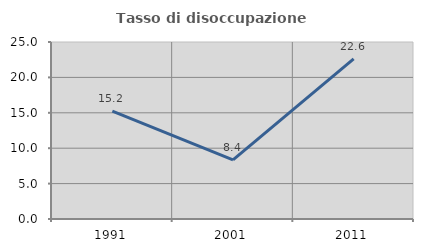
| Category | Tasso di disoccupazione giovanile  |
|---|---|
| 1991.0 | 15.246 |
| 2001.0 | 8.352 |
| 2011.0 | 22.616 |